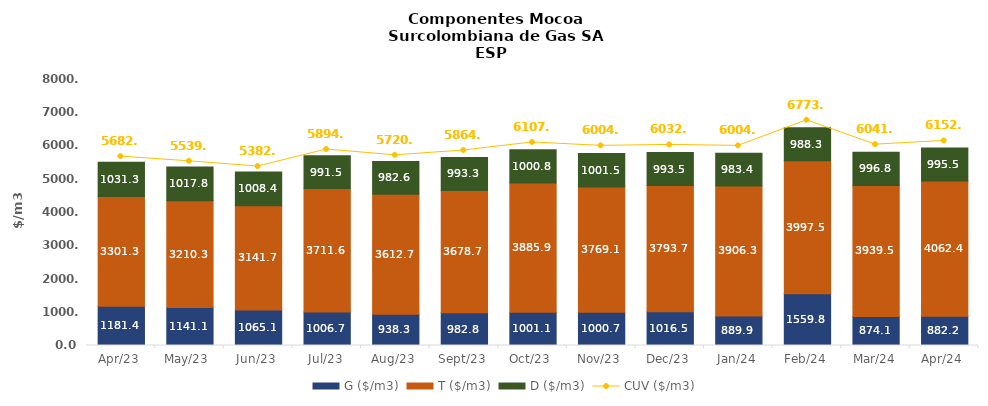
| Category | G ($/m3) | T ($/m3) | D ($/m3) |
|---|---|---|---|
| 2023-04-01 | 1181.36 | 3301.34 | 1031.34 |
| 2023-05-01 | 1141.05 | 3210.28 | 1017.81 |
| 2023-06-01 | 1065.07 | 3141.65 | 1008.39 |
| 2023-07-01 | 1006.71 | 3711.61 | 991.5 |
| 2023-08-01 | 938.29 | 3612.73 | 982.58 |
| 2023-09-01 | 982.76 | 3678.68 | 993.3 |
| 2023-10-01 | 1001.11 | 3885.88 | 1000.84 |
| 2023-11-01 | 1000.74 | 3769.12 | 1001.53 |
| 2023-12-01 | 1016.49 | 3793.69 | 993.53 |
| 2024-01-01 | 889.86 | 3906.34 | 983.35 |
| 2024-02-01 | 1559.75 | 3997.5 | 988.27 |
| 2024-03-01 | 874.14 | 3939.52 | 996.84 |
| 2024-04-01 | 882.19 | 4062.35 | 995.5 |